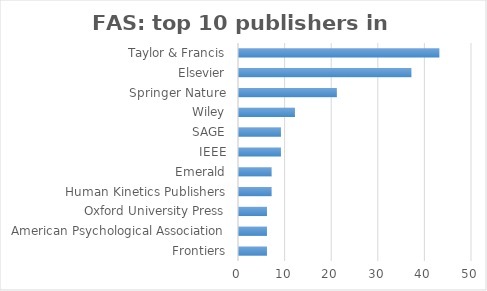
| Category | Series 0 |
|---|---|
| Frontiers | 6 |
| American Psychological Association | 6 |
| Oxford University Press | 6 |
| Human Kinetics Publishers | 7 |
| Emerald | 7 |
| IEEE | 9 |
| SAGE | 9 |
| Wiley | 12 |
| Springer Nature | 21 |
| Elsevier | 37 |
| Taylor & Francis | 43 |